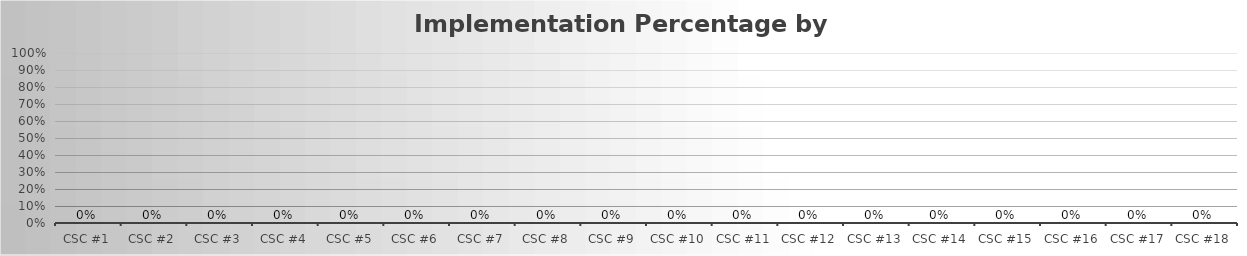
| Category | Series 0 |
|---|---|
| CSC #1 | 0 |
| CSC #2 | 0 |
| CSC #3 | 0 |
| CSC #4 | 0 |
| CSC #5 | 0 |
| CSC #6 | 0 |
| CSC #7 | 0 |
| CSC #8 | 0 |
| CSC #9 | 0 |
| CSC #10 | 0 |
| CSC #11 | 0 |
| CSC #12 | 0 |
| CSC #13 | 0 |
| CSC #14 | 0 |
| CSC #15 | 0 |
| CSC #16 | 0 |
| CSC #17 | 0 |
| CSC #18 | 0 |